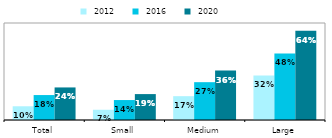
| Category |  2012 |  2016 |  2020 |
|---|---|---|---|
| Total | 0.099 | 0.18 | 0.235 |
| Small | 0.074 | 0.144 | 0.187 |
| Medium | 0.172 | 0.273 | 0.357 |
| Large | 0.322 | 0.48 | 0.644 |